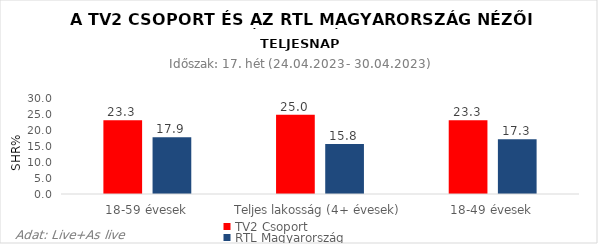
| Category | TV2 Csoport | RTL Magyarország |
|---|---|---|
| 18-59 évesek | 23.3 | 17.9 |
| Teljes lakosság (4+ évesek) | 25 | 15.8 |
| 18-49 évesek | 23.3 | 17.3 |